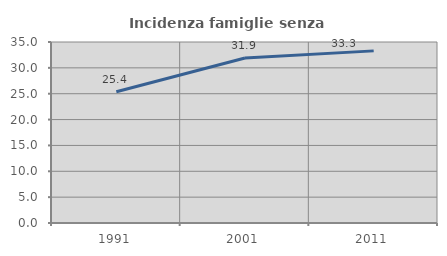
| Category | Incidenza famiglie senza nuclei |
|---|---|
| 1991.0 | 25.377 |
| 2001.0 | 31.91 |
| 2011.0 | 33.284 |